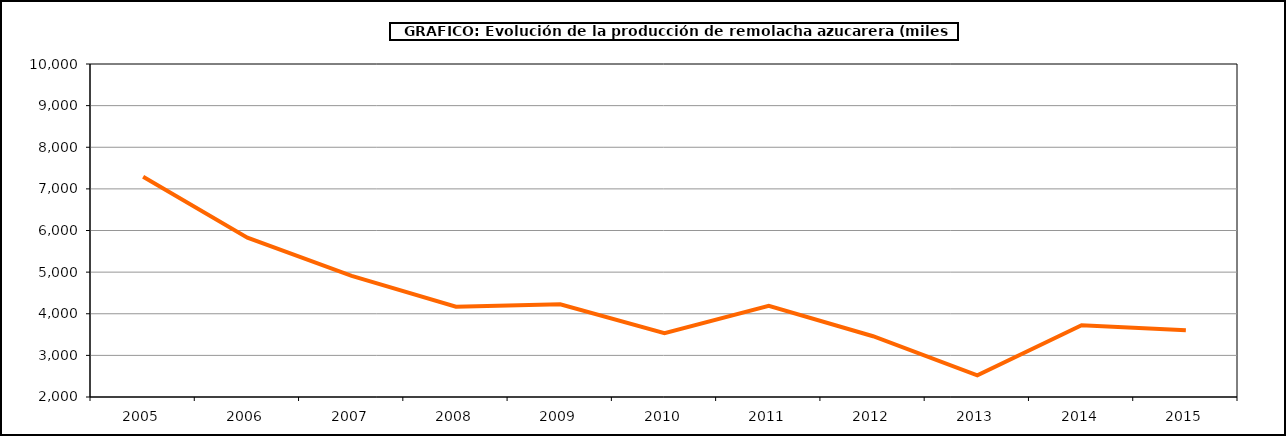
| Category | Producción |
|---|---|
| 2005.0 | 7291.092 |
| 2006.0 | 5827.031 |
| 2007.0 | 4909.958 |
| 2008.0 | 4170.442 |
| 2009.0 | 4225.433 |
| 2010.0 | 3534.517 |
| 2011.0 | 4188.535 |
| 2012.0 | 3460.23 |
| 2013.0 | 2519.482 |
| 2014.0 | 3723.309 |
| 2015.0 | 3605.112 |